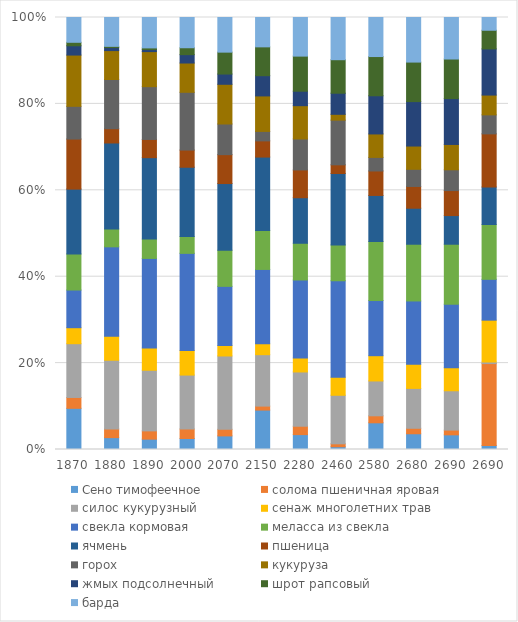
| Category | Сено тимофеечное | солома пшеничная яровая | силос кукурузный | сенаж многолетних трав | свекла кормовая | меласса из свекла | ячмень | пшеница | горох | кукуруза | жмых подсолнечный | шрот рапсовый | барда |
|---|---|---|---|---|---|---|---|---|---|---|---|---|---|
| 1870.0 | 9.533 | 2.514 | 12.443 | 3.704 | 8.72 | 8.357 | 15.004 | 11.589 | 7.579 | 11.864 | 2.152 | 0.803 | 5.741 |
| 1880.0 | 2.747 | 2.017 | 15.898 | 5.548 | 20.703 | 4.151 | 19.887 | 3.311 | 11.38 | 6.698 | 0.695 | 0.281 | 6.682 |
| 1890.0 | 2.394 | 1.915 | 14.033 | 5.154 | 20.735 | 4.467 | 18.853 | 4.221 | 12.216 | 8.116 | 0.467 | 0.388 | 7.038 |
| 2000.0 | 2.548 | 2.201 | 12.478 | 5.69 | 22.484 | 3.888 | 16.05 | 3.975 | 13.372 | 6.778 | 1.938 | 1.597 | 7.002 |
| 2070.0 | 3.148 | 1.515 | 16.983 | 2.423 | 13.697 | 8.357 | 15.441 | 6.69 | 7.092 | 9.193 | 2.372 | 5.068 | 8.02 |
| 2150.0 | 9.123 | 0.922 | 11.902 | 2.518 | 17.214 | 9.013 | 16.994 | 3.749 | 2.19 | 8.216 | 4.684 | 6.674 | 6.795 |
| 2280.0 | 3.448 | 1.94 | 12.561 | 3.227 | 18.063 | 8.501 | 10.539 | 6.436 | 7.168 | 7.705 | 3.348 | 8.126 | 8.94 |
| 2460.0 | 0.642 | 0.674 | 11.236 | 4.184 | 22.324 | 8.305 | 16.524 | 2.009 | 10.339 | 1.352 | 4.884 | 7.758 | 9.769 |
| 2580.0 | 6.179 | 1.621 | 8.066 | 5.847 | 12.769 | 13.666 | 10.661 | 5.665 | 3.142 | 5.428 | 8.837 | 9.08 | 9.038 |
| 2680.0 | 3.642 | 1.268 | 9.234 | 5.577 | 14.663 | 13.133 | 8.337 | 5.037 | 3.971 | 5.384 | 10.287 | 9.145 | 10.321 |
| 2690.0 | 3.392 | 1.099 | 9.102 | 5.354 | 14.68 | 13.89 | 6.633 | 5.784 | 4.811 | 5.866 | 10.619 | 9.158 | 9.611 |
| 2690.0 | 0.938 | 18.951 | 0.365 | 9.685 | 9.457 | 12.693 | 8.673 | 12.304 | 4.397 | 4.584 | 10.683 | 4.318 | 2.953 |